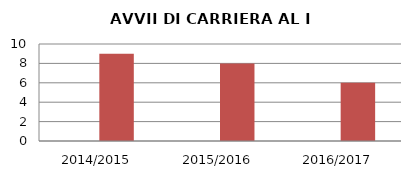
| Category | ANNO | NUMERO |
|---|---|---|
| 2014/2015 | 0 | 9 |
| 2015/2016 | 0 | 8 |
| 2016/2017 | 0 | 6 |